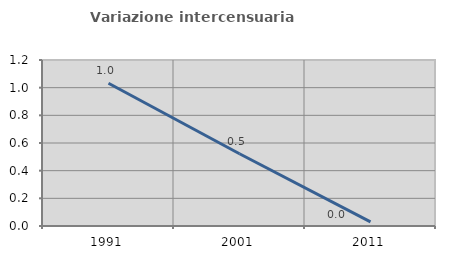
| Category | Variazione intercensuaria annua |
|---|---|
| 1991.0 | 1.032 |
| 2001.0 | 0.523 |
| 2011.0 | 0.03 |